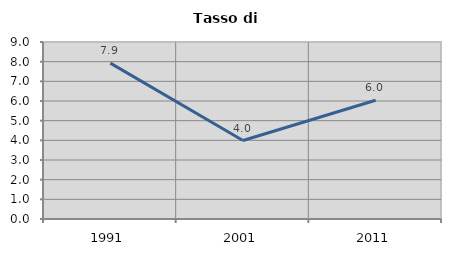
| Category | Tasso di disoccupazione   |
|---|---|
| 1991.0 | 7.924 |
| 2001.0 | 3.989 |
| 2011.0 | 6.038 |